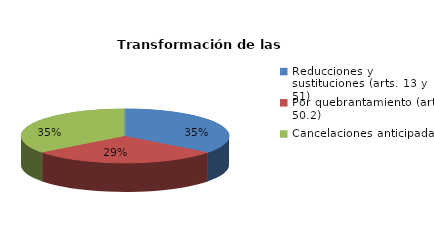
| Category | Series 0 |
|---|---|
| Reducciones y sustituciones (arts. 13 y 51) | 62 |
| Por quebrantamiento (art. 50.2) | 51 |
| Cancelaciones anticipadas | 62 |
| Traslado a Centros Penitenciarios | 0 |
| Conversión internamientos en cerrados (art. 51.2) | 0 |